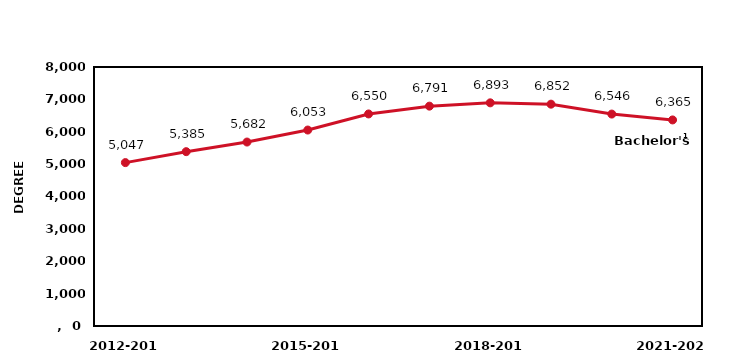
| Category | Series 0 |
|---|---|
| 2012-2013 | 5047 |
| 2013-2014 | 5385 |
| 2014-2015 | 5682 |
| 2015-2016 | 6053 |
| 2016-2017 | 6550 |
| 2017-2018 | 6791 |
| 2018-2019 | 6893 |
| 2019-2020 | 6852 |
| 2020-2021 | 6546 |
| 2021-2022 | 6365 |